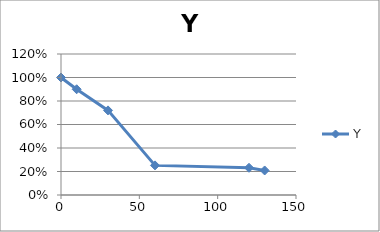
| Category | Y |
|---|---|
| 0.0 | 1 |
| 10.0 | 0.9 |
| 30.0 | 0.72 |
| 60.0 | 0.252 |
| 120.0 | 0.232 |
| 130.0 | 0.209 |